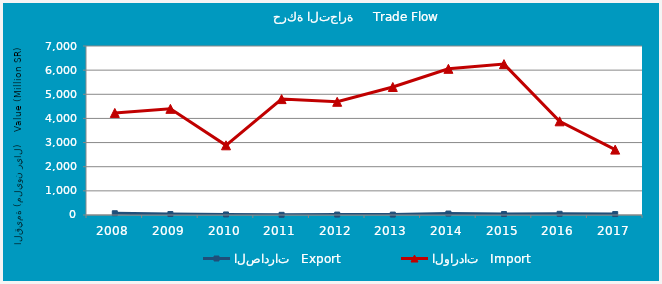
| Category | الصادرات   Export | الواردات   Import |
|---|---|---|
| 2008.0 | 72674024 | 4226852164 |
| 2009.0 | 40132372 | 4396728193 |
| 2010.0 | 22254071 | 2887058294 |
| 2011.0 | 7644227 | 4800236522 |
| 2012.0 | 17538661 | 4688971214 |
| 2013.0 | 16646967 | 5301874058 |
| 2014.0 | 60081759 | 6054683392 |
| 2015.0 | 39939165 | 6249099432 |
| 2016.0 | 49438262 | 3880509914 |
| 2017.0 | 38344734 | 2708062128 |